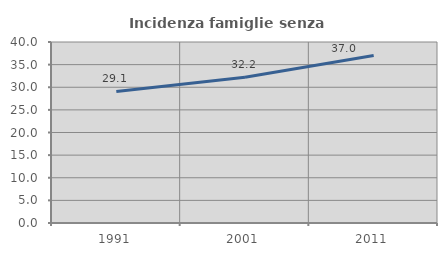
| Category | Incidenza famiglie senza nuclei |
|---|---|
| 1991.0 | 29.077 |
| 2001.0 | 32.212 |
| 2011.0 | 37.031 |